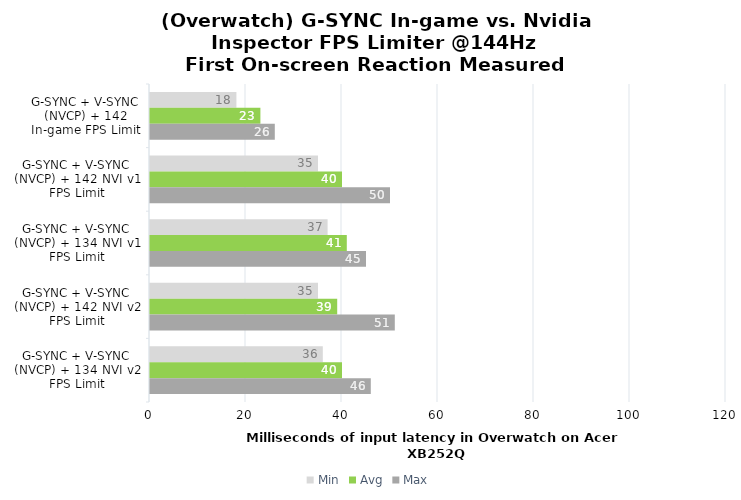
| Category | Min | Avg | Max |
|---|---|---|---|
| G-SYNC + V-SYNC (NVCP) + 142 In-game FPS Limit | 18 | 23 | 26 |
| G-SYNC + V-SYNC (NVCP) + 142 NVI v1 FPS Limit | 35 | 40 | 50 |
| G-SYNC + V-SYNC (NVCP) + 134 NVI v1 FPS Limit | 37 | 41 | 45 |
| G-SYNC + V-SYNC (NVCP) + 142 NVI v2 FPS Limit | 35 | 39 | 51 |
| G-SYNC + V-SYNC (NVCP) + 134 NVI v2 FPS Limit | 36 | 40 | 46 |